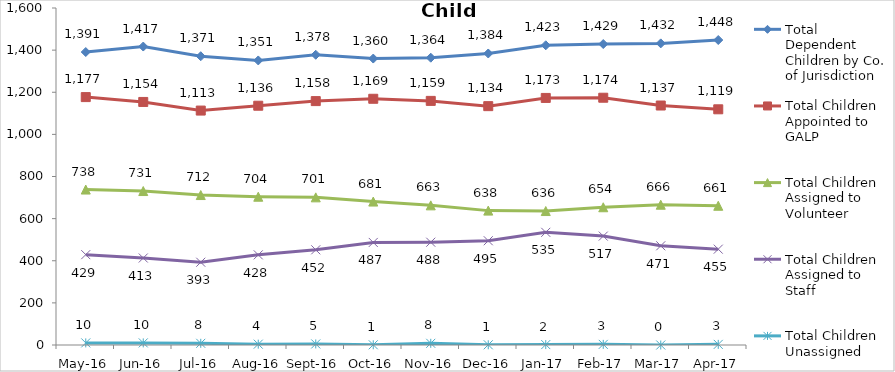
| Category | Total Dependent Children by Co. of Jurisdiction | Total Children Appointed to GALP | Total Children Assigned to Volunteer | Total Children Assigned to Staff | Total Children Unassigned |
|---|---|---|---|---|---|
| May-16 | 1391 | 1177 | 738 | 429 | 10 |
| Jun-16 | 1417 | 1154 | 731 | 413 | 10 |
| Jul-16 | 1371 | 1113 | 712 | 393 | 8 |
| Aug-16 | 1351 | 1136 | 704 | 428 | 4 |
| Sep-16 | 1378 | 1158 | 701 | 452 | 5 |
| Oct-16 | 1360 | 1169 | 681 | 487 | 1 |
| Nov-16 | 1364 | 1159 | 663 | 488 | 8 |
| Dec-16 | 1384 | 1134 | 638 | 495 | 1 |
| Jan-17 | 1423 | 1173 | 636 | 535 | 2 |
| Feb-17 | 1429 | 1174 | 654 | 517 | 3 |
| Mar-17 | 1432 | 1137 | 666 | 471 | 0 |
| Apr-17 | 1448 | 1119 | 661 | 455 | 3 |